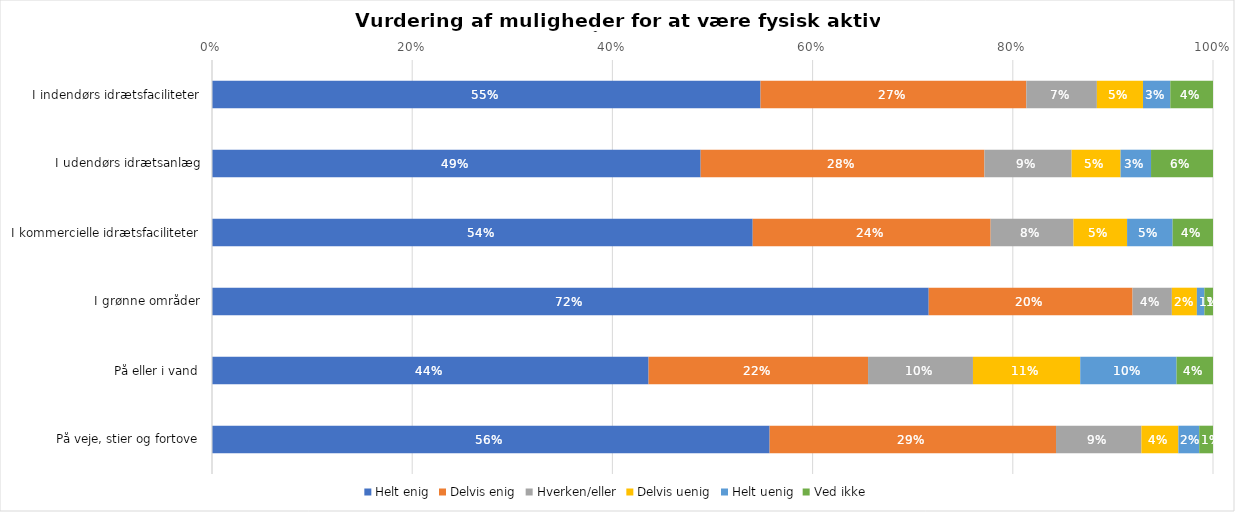
| Category | Helt enig | Delvis enig | Hverken/eller | Delvis uenig | Helt uenig | Ved ikke |
|---|---|---|---|---|---|---|
| I indendørs idrætsfaciliteter | 0.548 | 0.266 | 0.07 | 0.046 | 0.027 | 0.043 |
| I udendørs idrætsanlæg | 0.488 | 0.283 | 0.087 | 0.049 | 0.03 | 0.062 |
| I kommercielle idrætsfaciliteter | 0.54 | 0.238 | 0.083 | 0.054 | 0.046 | 0.04 |
| I grønne områder | 0.716 | 0.204 | 0.039 | 0.025 | 0.008 | 0.009 |
| På eller i vand | 0.436 | 0.219 | 0.105 | 0.107 | 0.096 | 0.036 |
| På veje, stier og fortove | 0.557 | 0.286 | 0.085 | 0.037 | 0.021 | 0.014 |